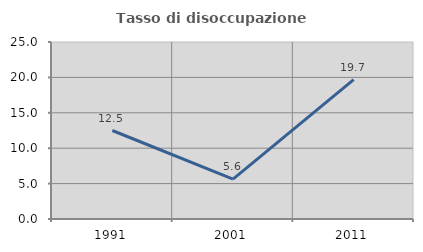
| Category | Tasso di disoccupazione giovanile  |
|---|---|
| 1991.0 | 12.5 |
| 2001.0 | 5.634 |
| 2011.0 | 19.697 |